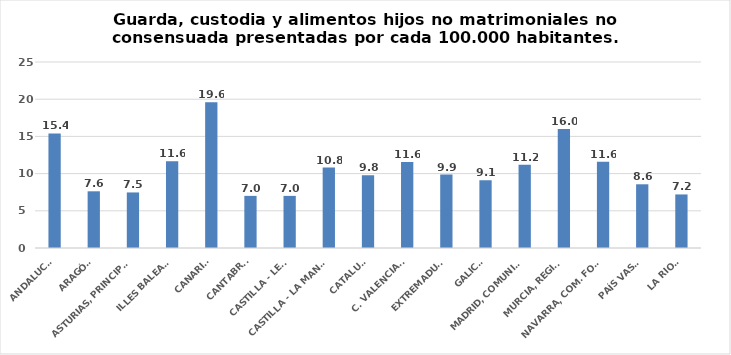
| Category | Series 0 |
|---|---|
| ANDALUCÍA | 15.401 |
| ARAGÓN | 7.621 |
| ASTURIAS, PRINCIPADO | 7.466 |
| ILLES BALEARS | 11.647 |
| CANARIAS | 19.573 |
| CANTABRIA | 7.006 |
| CASTILLA - LEÓN | 7.004 |
| CASTILLA - LA MANCHA | 10.818 |
| CATALUÑA | 9.79 |
| C. VALENCIANA | 11.55 |
| EXTREMADURA | 9.865 |
| GALICIA | 9.111 |
| MADRID, COMUNIDAD | 11.18 |
| MURCIA, REGIÓN | 15.998 |
| NAVARRA, COM. FORAL | 11.603 |
| PAÍS VASCO | 8.563 |
| LA RIOJA | 7.199 |